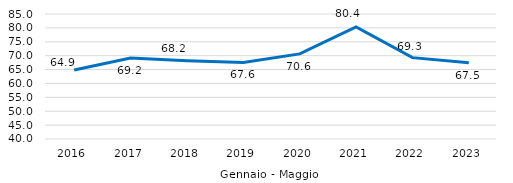
| Category | Series 0 |
|---|---|
| 0 | 64.87 |
| 1 | 69.167 |
| 2 | 68.213 |
| 3 | 67.553 |
| 4 | 70.637 |
| 5 | 80.369 |
| 6 | 69.291 |
| 7 | 67.468 |